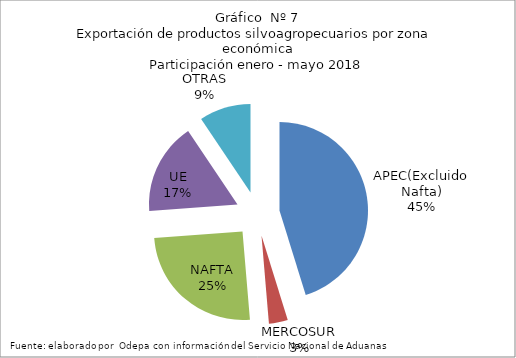
| Category | Series 0 |
|---|---|
| APEC(Excluido Nafta) | 3609517.642 |
| MERCOSUR | 275278.451 |
| NAFTA | 2011000.078 |
| UE | 1335589.14 |
| OTRAS | 752045.688 |